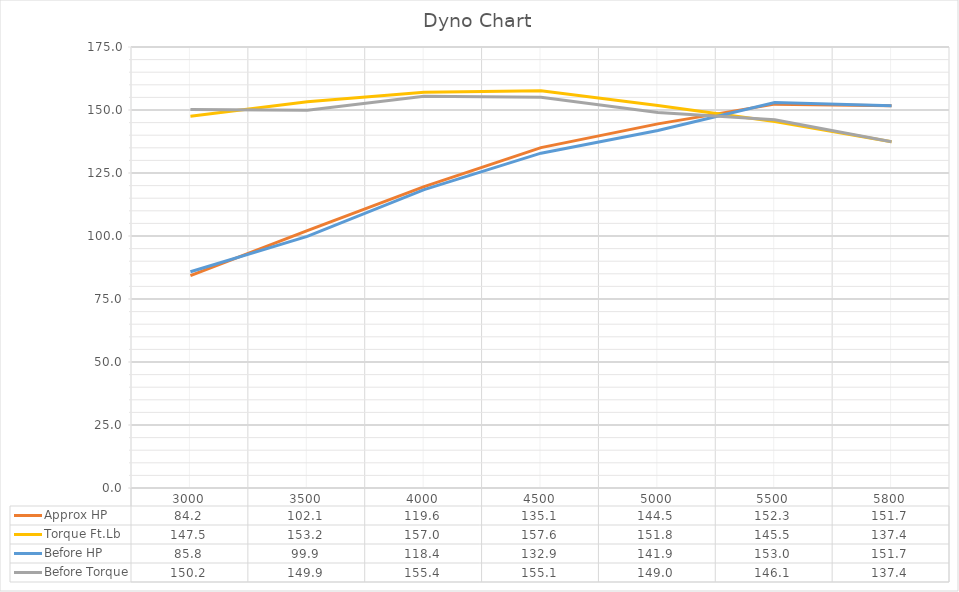
| Category | Approx HP | Torque Ft.Lb | Before HP | Before Torque |
|---|---|---|---|---|
| 3000.0 | 84.238 | 147.476 | 85.808 | 150.224 |
| 3500.0 | 102.124 | 153.247 | 99.865 | 149.858 |
| 4000.0 | 119.573 | 157.003 | 118.387 | 155.446 |
| 4500.0 | 135.069 | 157.644 | 132.872 | 155.079 |
| 5000.0 | 144.496 | 151.782 | 141.88 | 149.034 |
| 5500.0 | 152.327 | 145.461 | 152.998 | 146.102 |
| 5800.0 | 151.734 | 137.4 | 151.734 | 137.4 |